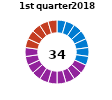
| Category | Series 0 |
|---|---|
| 0 | 1 |
| 1 | 1 |
| 2 | 1 |
| 3 | 1 |
| 4 | 1 |
| 5 | 1 |
| 6 | 1 |
| 7 | 1 |
| 8 | 1 |
| 9 | 1 |
| 10 | 1 |
| 11 | 1 |
| 12 | 1 |
| 13 | 1 |
| 14 | 1 |
| 15 | 1 |
| 16 | 1 |
| 17 | 1 |
| 18 | 1 |
| 19 | 1 |
| 20 | 1 |
| 21 | 1 |